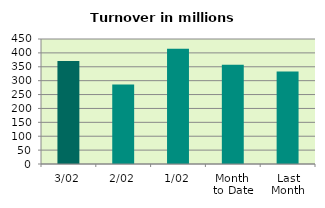
| Category | Series 0 |
|---|---|
| 3/02 | 371.152 |
| 2/02 | 286.248 |
| 1/02 | 414.77 |
| Month 
to Date | 357.39 |
| Last
Month | 332.646 |